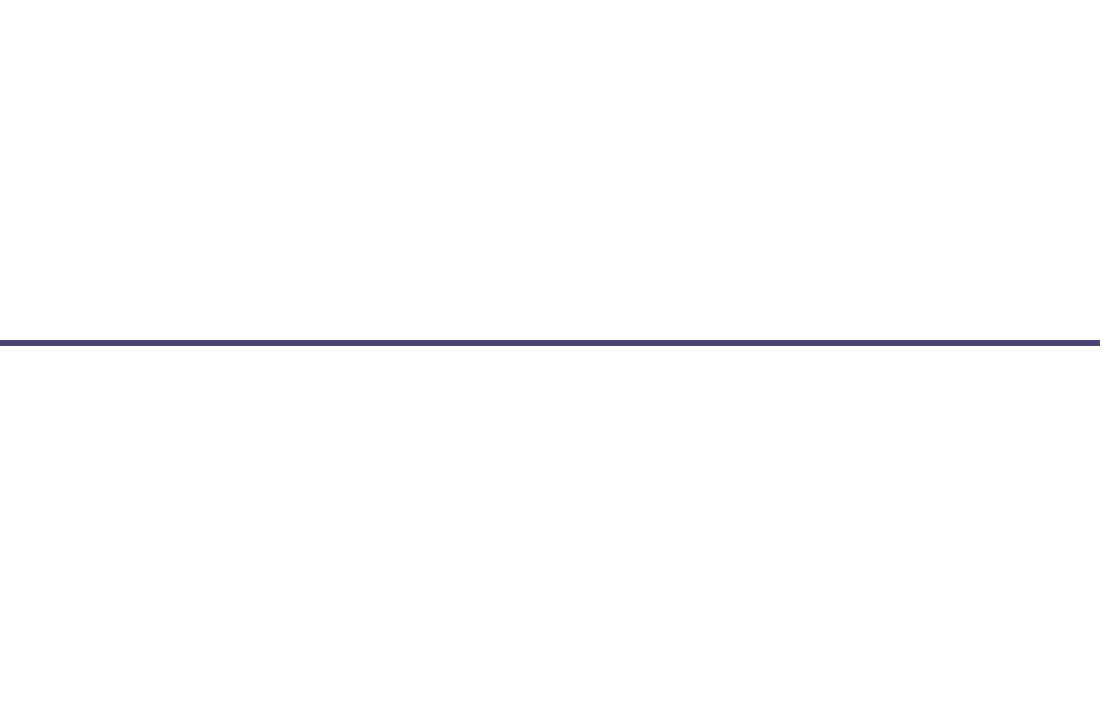
| Category | Posisjon |
|---|---|
| 0 | 1 |
| 1 | -2 |
| 2 | 1 |
| 3 | -1 |
| 4 | -0.5 |
| 5 | 2 |
| 6 | 0.5 |
| 7 | -1 |
| 8 | 0.5 |
| 9 | -2 |